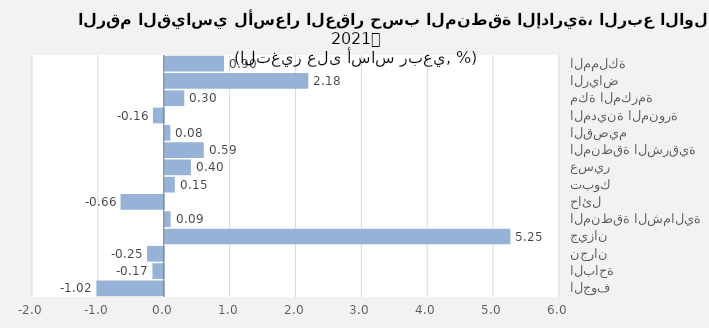
| Category | 2021 |
|---|---|
| المملكة | 0.9 |
| الرياض | 2.18 |
| مكة المكرمة | 0.297 |
| المدينة المنورة | -0.165 |
| القصيم | 0.085 |
| المنطقة الشرقية | 0.593 |
| عسير | 0.397 |
| تبوك | 0.153 |
| حائل | -0.656 |
| المنطقة الشمالية | 0.089 |
| جيزان | 5.247 |
| نجران | -0.254 |
| الباحة | -0.172 |
| الجوف | -1.023 |